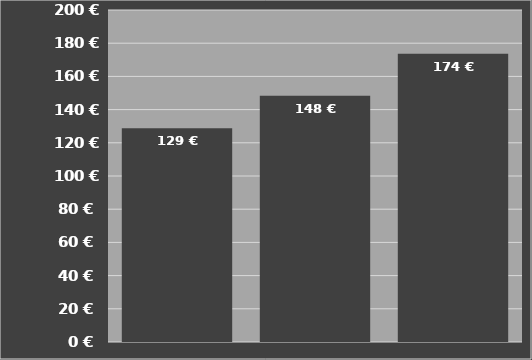
| Category | Kosten je Stunde |
|---|---|
| Seco Duplex
650 F Front | 128.805 |
| Seco Duplex
800 F Front | 148.349 |